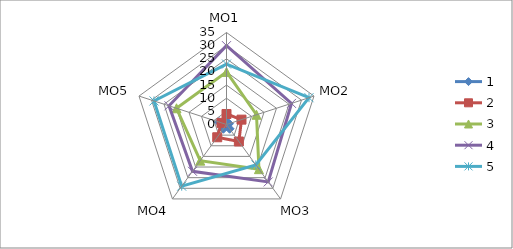
| Category | 1 | 2 | 3 | 4 | 5 |
|---|---|---|---|---|---|
| MO1 | 1 | 4 | 20 | 30 | 23 |
| MO2 | 1 | 6 | 12 | 26 | 33 |
| MO3 | 2 | 8 | 21 | 27 | 19 |
| MO4 | 2 | 6 | 17 | 22 | 29 |
| MO5 | 3 | 2 | 20 | 23 | 29 |